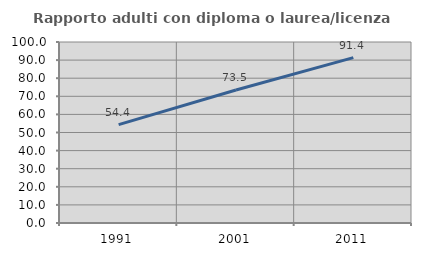
| Category | Rapporto adulti con diploma o laurea/licenza media  |
|---|---|
| 1991.0 | 54.354 |
| 2001.0 | 73.497 |
| 2011.0 | 91.385 |